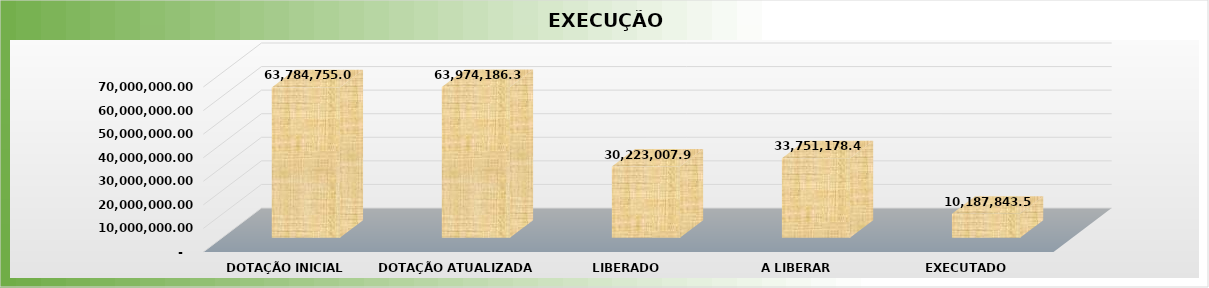
| Category | Series 0 |
|---|---|
| 0 | 63784755 |
| 1 | 63974186.35 |
| 2 | 30223007.91 |
| 3 | 33751178.44 |
| 4 | 10187843.52 |